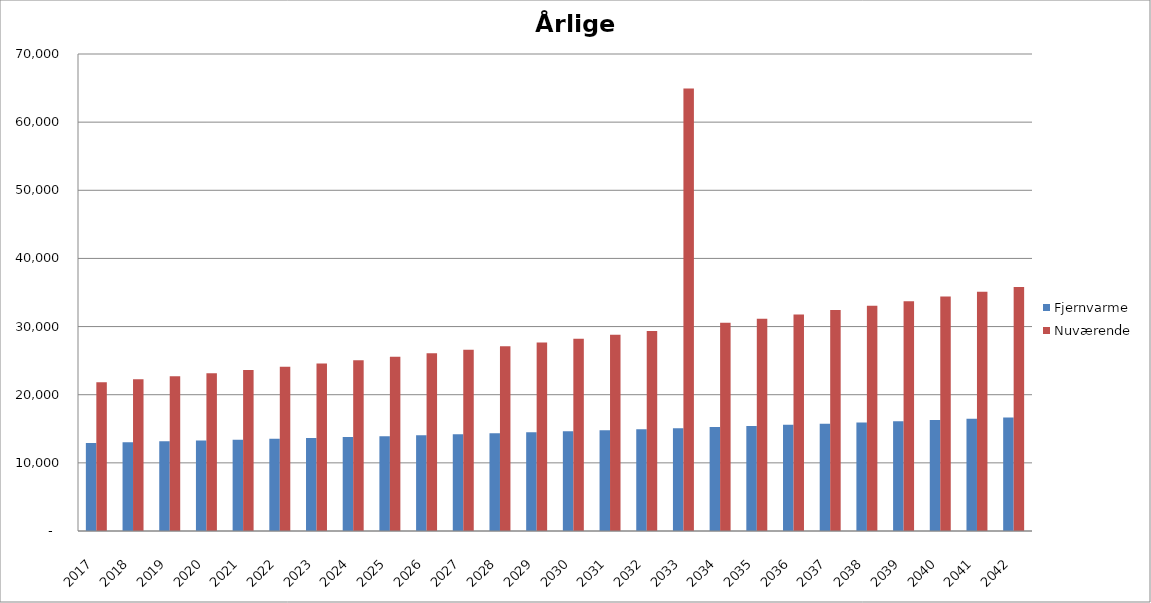
| Category | Fjernvarme | Nuværende |
|---|---|---|
| 2017.0 | 12923.454 | 21818 |
| 2018.0 | 13039.765 | 22254.36 |
| 2019.0 | 13158.402 | 22699.447 |
| 2020.0 | 13279.412 | 23153.436 |
| 2021.0 | 13402.842 | 23616.505 |
| 2022.0 | 13528.741 | 24088.835 |
| 2023.0 | 13657.158 | 24570.612 |
| 2024.0 | 13788.143 | 25062.024 |
| 2025.0 | 13921.748 | 25563.264 |
| 2026.0 | 14058.025 | 26074.53 |
| 2027.0 | 14197.028 | 26596.02 |
| 2028.0 | 14338.81 | 27127.941 |
| 2029.0 | 14483.428 | 27670.499 |
| 2030.0 | 14630.939 | 28223.909 |
| 2031.0 | 14781.4 | 28788.388 |
| 2032.0 | 14934.87 | 29364.155 |
| 2033.0 | 15091.409 | 64951.439 |
| 2034.0 | 15251.079 | 30550.467 |
| 2035.0 | 15413.943 | 31161.477 |
| 2036.0 | 15580.064 | 31784.706 |
| 2037.0 | 15749.507 | 32420.4 |
| 2038.0 | 15922.339 | 33068.808 |
| 2039.0 | 16098.628 | 33730.184 |
| 2040.0 | 16278.443 | 34404.788 |
| 2041.0 | 16461.854 | 35092.884 |
| 2042.0 | 16648.933 | 35794.742 |